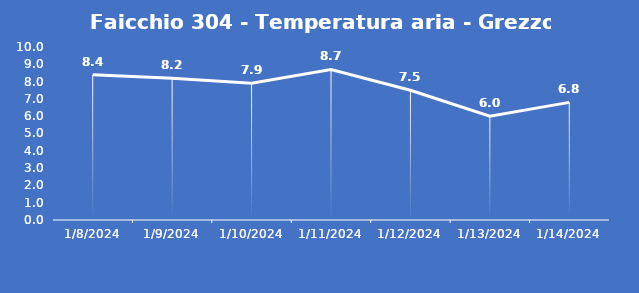
| Category | Faicchio 304 - Temperatura aria - Grezzo (°C) |
|---|---|
| 1/8/24 | 8.4 |
| 1/9/24 | 8.2 |
| 1/10/24 | 7.9 |
| 1/11/24 | 8.7 |
| 1/12/24 | 7.5 |
| 1/13/24 | 6 |
| 1/14/24 | 6.8 |